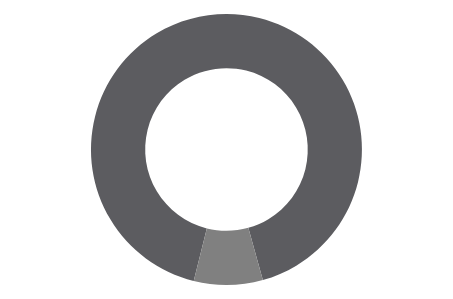
| Category | Series 0 |
|---|---|
| 0 | 33982 |
| 1 | 3040 |